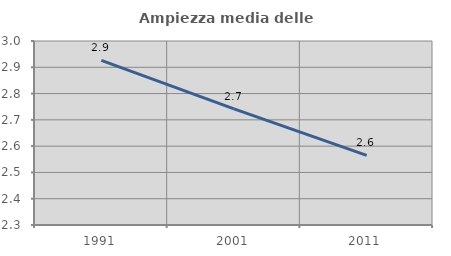
| Category | Ampiezza media delle famiglie |
|---|---|
| 1991.0 | 2.926 |
| 2001.0 | 2.742 |
| 2011.0 | 2.565 |